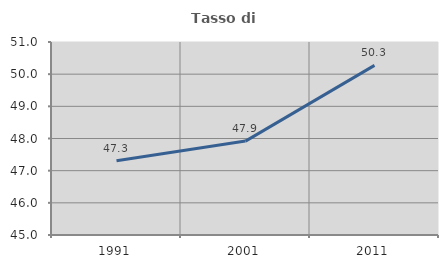
| Category | Tasso di occupazione   |
|---|---|
| 1991.0 | 47.305 |
| 2001.0 | 47.919 |
| 2011.0 | 50.274 |